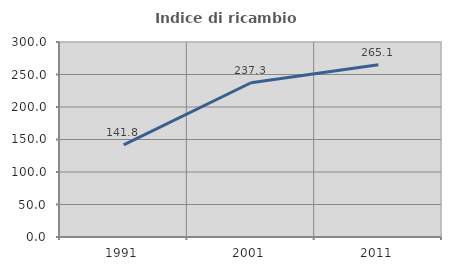
| Category | Indice di ricambio occupazionale  |
|---|---|
| 1991.0 | 141.818 |
| 2001.0 | 237.333 |
| 2011.0 | 265.116 |